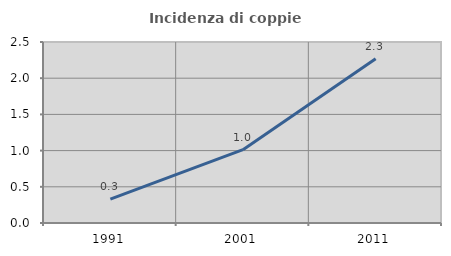
| Category | Incidenza di coppie miste |
|---|---|
| 1991.0 | 0.329 |
| 2001.0 | 1.013 |
| 2011.0 | 2.267 |